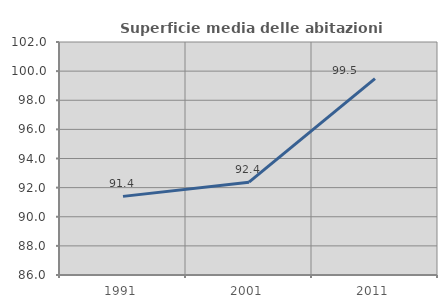
| Category | Superficie media delle abitazioni occupate |
|---|---|
| 1991.0 | 91.399 |
| 2001.0 | 92.372 |
| 2011.0 | 99.49 |